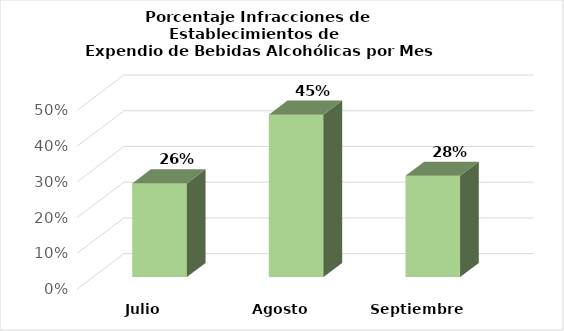
| Category | Series 0 |
|---|---|
| Julio | 0.262 |
| Agosto | 0.455 |
| Septiembre | 0.283 |